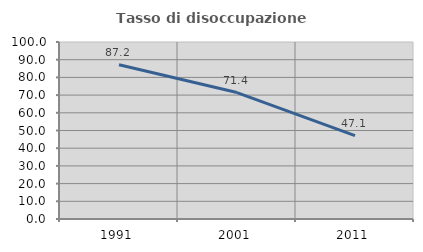
| Category | Tasso di disoccupazione giovanile  |
|---|---|
| 1991.0 | 87.179 |
| 2001.0 | 71.429 |
| 2011.0 | 47.059 |